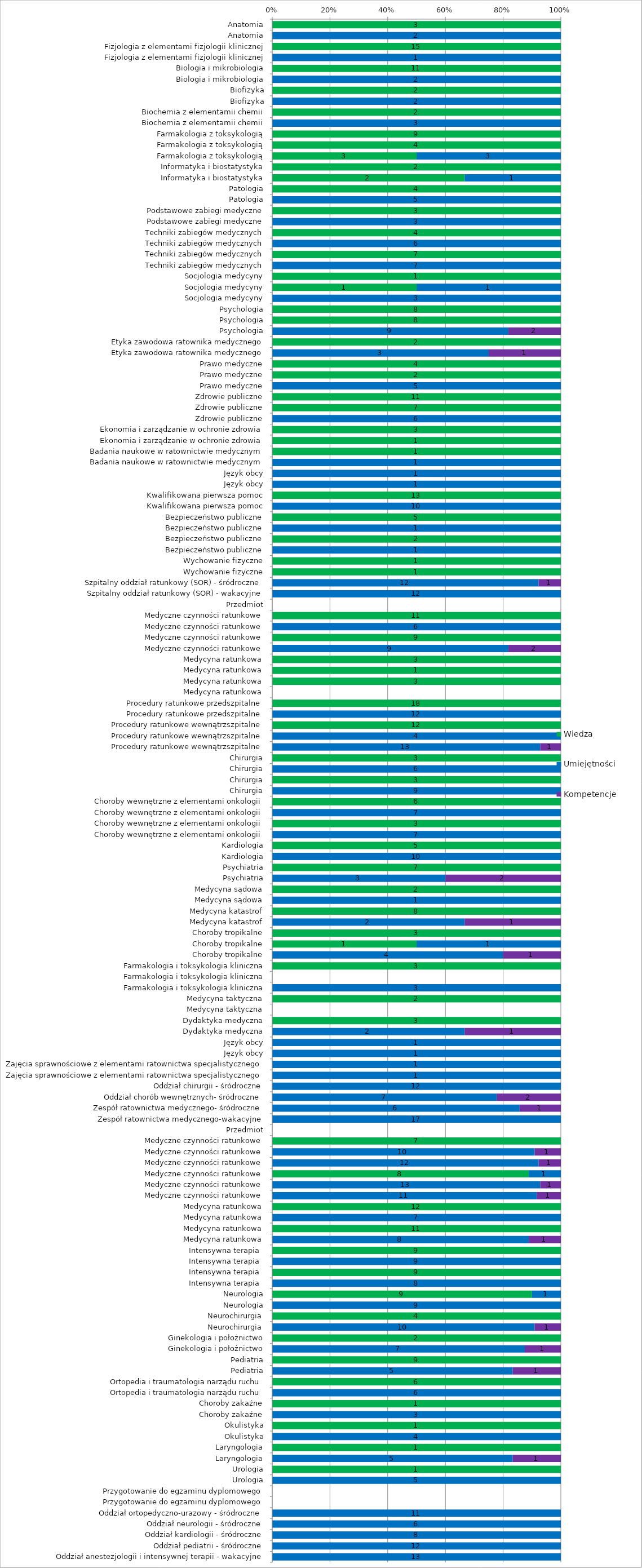
| Category | Wiedza | Umiejętności | Kompetencje |
|---|---|---|---|
| Anatomia | 3 | 0 | 0 |
| Anatomia | 0 | 2 | 0 |
| Fizjologia z elementami fizjologii klinicznej | 15 | 0 | 0 |
| Fizjologia z elementami fizjologii klinicznej | 0 | 1 | 0 |
| Biologia i mikrobiologia | 11 | 0 | 0 |
| Biologia i mikrobiologia | 0 | 2 | 0 |
| Biofizyka | 2 | 0 | 0 |
| Biofizyka | 0 | 2 | 0 |
| Biochemia z elementamii chemii | 2 | 0 | 0 |
| Biochemia z elementamii chemii | 0 | 3 | 0 |
| Farmakologia z toksykologią | 9 | 0 | 0 |
| Farmakologia z toksykologią | 4 | 0 | 0 |
| Farmakologia z toksykologią | 3 | 3 | 0 |
| Informatyka i biostatystyka | 2 | 0 | 0 |
| Informatyka i biostatystyka | 2 | 1 | 0 |
| Patologia | 4 | 0 | 0 |
| Patologia | 0 | 5 | 0 |
| Podstawowe zabiegi medyczne | 3 | 0 | 0 |
| Podstawowe zabiegi medyczne | 0 | 3 | 0 |
| Techniki zabiegów medycznych | 4 | 0 | 0 |
| Techniki zabiegów medycznych | 0 | 6 | 0 |
| Techniki zabiegów medycznych | 7 | 0 | 0 |
| Techniki zabiegów medycznych | 0 | 7 | 0 |
| Socjologia medycyny | 1 | 0 | 0 |
| Socjologia medycyny | 1 | 1 | 0 |
| Socjologia medycyny | 0 | 3 | 0 |
| Psychologia | 8 | 0 | 0 |
| Psychologia | 8 | 0 | 0 |
| Psychologia | 0 | 9 | 2 |
| Etyka zawodowa ratownika medycznego | 2 | 0 | 0 |
| Etyka zawodowa ratownika medycznego | 0 | 3 | 1 |
| Prawo medyczne | 4 | 0 | 0 |
| Prawo medyczne | 2 | 0 | 0 |
| Prawo medyczne | 0 | 5 | 0 |
| Zdrowie publiczne | 11 | 0 | 0 |
| Zdrowie publiczne | 7 | 0 | 0 |
| Zdrowie publiczne | 0 | 6 | 0 |
| Ekonomia i zarządzanie w ochronie zdrowia | 3 | 0 | 0 |
| Ekonomia i zarządzanie w ochronie zdrowia | 1 | 0 | 0 |
| Badania naukowe w ratownictwie medycznym | 1 | 0 | 0 |
| Badania naukowe w ratownictwie medycznym | 0 | 1 | 0 |
| Język obcy | 0 | 1 | 0 |
| Język obcy | 0 | 1 | 0 |
| Kwalifikowana pierwsza pomoc | 13 | 0 | 0 |
| Kwalifikowana pierwsza pomoc | 0 | 10 | 0 |
| Bezpieczeństwo publiczne | 5 | 0 | 0 |
| Bezpieczeństwo publiczne | 0 | 1 | 0 |
| Bezpieczeństwo publiczne | 2 | 0 | 0 |
| Bezpieczeństwo publiczne | 0 | 1 | 0 |
| Wychowanie fizyczne | 1 | 0 | 0 |
| Wychowanie fizyczne | 1 | 0 | 0 |
| Szpitalny oddział ratunkowy (SOR) - śródroczne | 0 | 12 | 1 |
| Szpitalny oddział ratunkowy (SOR) - wakacyjne | 0 | 12 | 0 |
| Przedmiot | 0 | 0 | 0 |
| Medyczne czynności ratunkowe | 11 | 0 | 0 |
| Medyczne czynności ratunkowe | 0 | 6 | 0 |
| Medyczne czynności ratunkowe | 9 | 0 | 0 |
| Medyczne czynności ratunkowe | 0 | 9 | 2 |
| Medycyna ratunkowa | 3 | 0 | 0 |
| Medycyna ratunkowa | 1 | 0 | 0 |
| Medycyna ratunkowa | 3 | 0 | 0 |
| Medycyna ratunkowa | 0 | 0 | 0 |
| Procedury ratunkowe przedszpitalne | 18 | 0 | 0 |
| Procedury ratunkowe przedszpitalne | 0 | 12 | 0 |
| Procedury ratunkowe wewnątrzszpitalne | 12 | 0 | 0 |
| Procedury ratunkowe wewnątrzszpitalne | 0 | 4 | 0 |
| Procedury ratunkowe wewnątrzszpitalne | 0 | 13 | 1 |
| Chirurgia | 3 | 0 | 0 |
| Chirurgia | 0 | 6 | 0 |
| Chirurgia | 3 | 0 | 0 |
| Chirurgia | 0 | 9 | 0 |
| Choroby wewnętrzne z elementami onkologii | 6 | 0 | 0 |
| Choroby wewnętrzne z elementami onkologii | 0 | 7 | 0 |
| Choroby wewnętrzne z elementami onkologii | 3 | 0 | 0 |
| Choroby wewnętrzne z elementami onkologii | 0 | 7 | 0 |
| Kardiologia | 5 | 0 | 0 |
| Kardiologia | 0 | 10 | 0 |
| Psychiatria | 7 | 0 | 0 |
| Psychiatria | 0 | 3 | 2 |
| Medycyna sądowa | 2 | 0 | 0 |
| Medycyna sądowa | 0 | 1 | 0 |
| Medycyna katastrof | 8 | 0 | 0 |
| Medycyna katastrof | 0 | 2 | 1 |
| Choroby tropikalne | 3 | 0 | 0 |
| Choroby tropikalne | 1 | 1 | 0 |
| Choroby tropikalne | 0 | 4 | 1 |
| Farmakologia i toksykologia kliniczna | 3 | 0 | 0 |
| Farmakologia i toksykologia kliniczna | 0 | 0 | 0 |
| Farmakologia i toksykologia kliniczna | 0 | 3 | 0 |
| Medycyna taktyczna | 2 | 0 | 0 |
| Medycyna taktyczna | 0 | 0 | 0 |
| Dydaktyka medyczna | 3 | 0 | 0 |
| Dydaktyka medyczna | 0 | 2 | 1 |
| Język obcy | 0 | 1 | 0 |
| Język obcy | 0 | 1 | 0 |
| Zajęcia sprawnościowe z elementami ratownictwa specjalistycznego | 0 | 1 | 0 |
| Zajęcia sprawnościowe z elementami ratownictwa specjalistycznego | 0 | 1 | 0 |
| Oddział chirurgii - śródroczne | 0 | 12 | 0 |
| Oddział chorób wewnętrznych- śródroczne | 0 | 7 | 2 |
| Zespół ratownictwa medycznego- śródroczne | 0 | 6 | 1 |
| Zespół ratownictwa medycznego-wakacyjne | 0 | 17 | 0 |
| Przedmiot | 0 | 0 | 0 |
| Medyczne czynności ratunkowe | 7 | 0 | 0 |
| Medyczne czynności ratunkowe | 0 | 10 | 1 |
| Medyczne czynności ratunkowe | 0 | 12 | 1 |
| Medyczne czynności ratunkowe | 8 | 1 | 0 |
| Medyczne czynności ratunkowe | 0 | 13 | 1 |
| Medyczne czynności ratunkowe | 0 | 11 | 1 |
| Medycyna ratunkowa | 12 | 0 | 0 |
| Medycyna ratunkowa | 0 | 7 | 0 |
| Medycyna ratunkowa | 11 | 0 | 0 |
| Medycyna ratunkowa | 0 | 8 | 1 |
| Intensywna terapia  | 9 | 0 | 0 |
| Intensywna terapia  | 0 | 9 | 0 |
| Intensywna terapia  | 9 | 0 | 0 |
| Intensywna terapia  | 0 | 8 | 0 |
| Neurologia | 9 | 1 | 0 |
| Neurologia | 0 | 9 | 0 |
| Neurochirurgia | 4 | 0 | 0 |
| Neurochirurgia | 0 | 10 | 1 |
| Ginekologia i położnictwo | 2 | 0 | 0 |
| Ginekologia i położnictwo | 0 | 7 | 1 |
| Pediatria | 9 | 0 | 0 |
| Pediatria | 0 | 5 | 1 |
| Ortopedia i traumatologia narządu ruchu | 6 | 0 | 0 |
| Ortopedia i traumatologia narządu ruchu | 0 | 6 | 0 |
| Choroby zakaźne | 1 | 0 | 0 |
| Choroby zakaźne | 0 | 3 | 0 |
| Okulistyka | 1 | 0 | 0 |
| Okulistyka | 0 | 4 | 0 |
| Laryngologia | 1 | 0 | 0 |
| Laryngologia | 0 | 5 | 1 |
| Urologia | 1 | 0 | 0 |
| Urologia | 0 | 5 | 0 |
| Przygotowanie do egzaminu dyplomowego | 0 | 0 | 0 |
| Przygotowanie do egzaminu dyplomowego | 0 | 0 | 0 |
| Oddział ortopedyczno-urazowy - śródroczne | 0 | 11 | 0 |
| Oddział neurologii - śródroczne | 0 | 6 | 0 |
| Oddział kardiologii - śródroczne | 0 | 8 | 0 |
| Oddział pediatrii - śródroczne | 0 | 12 | 0 |
| Oddział anestezjologii i intensywnej terapii - wakacyjne | 0 | 13 | 0 |